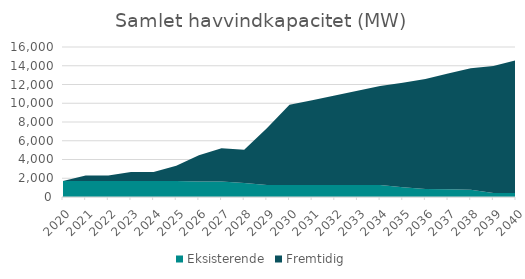
| Category | Eksisterende | Fremtidig |
|---|---|---|
| 2020.0 | 1700.8 | 0 |
| 2021.0 | 1700.8 | 605 |
| 2022.0 | 1700.8 | 605 |
| 2023.0 | 1700.8 | 955 |
| 2024.0 | 1700.8 | 955 |
| 2025.0 | 1700.8 | 1630 |
| 2026.0 | 1655.8 | 2805 |
| 2027.0 | 1655.8 | 3545 |
| 2028.0 | 1495.8 | 3545 |
| 2029.0 | 1284.7 | 6045 |
| 2030.0 | 1284.7 | 8545 |
| 2031.0 | 1284.7 | 9045 |
| 2032.0 | 1284.7 | 9545 |
| 2033.0 | 1284.7 | 10045 |
| 2034.0 | 1284.7 | 10545 |
| 2035.0 | 1047.2 | 11145 |
| 2036.0 | 840.2 | 11745 |
| 2037.0 | 836.6 | 12345 |
| 2038.0 | 786.2 | 12945 |
| 2039.0 | 437 | 13545 |
| 2040.0 | 437 | 14145 |